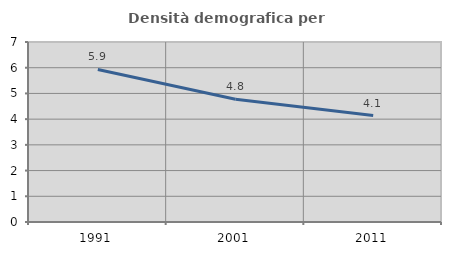
| Category | Densità demografica |
|---|---|
| 1991.0 | 5.933 |
| 2001.0 | 4.773 |
| 2011.0 | 4.138 |